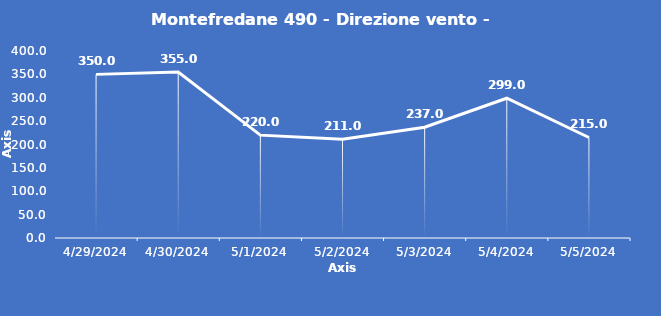
| Category | Montefredane 490 - Direzione vento - Grezzo (°N) |
|---|---|
| 4/29/24 | 350 |
| 4/30/24 | 355 |
| 5/1/24 | 220 |
| 5/2/24 | 211 |
| 5/3/24 | 237 |
| 5/4/24 | 299 |
| 5/5/24 | 215 |